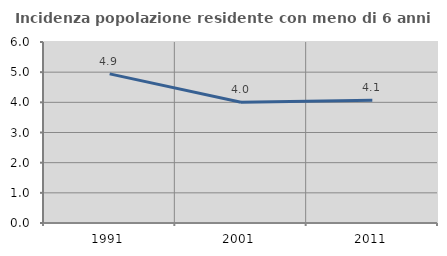
| Category | Incidenza popolazione residente con meno di 6 anni |
|---|---|
| 1991.0 | 4.943 |
| 2001.0 | 4.005 |
| 2011.0 | 4.065 |